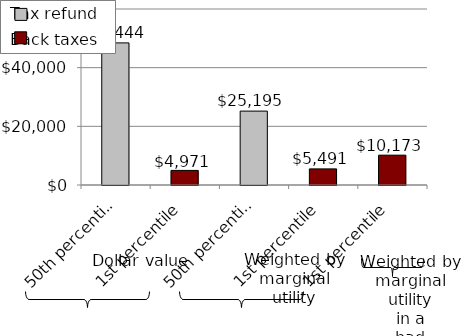
| Category | Series 0 |
|---|---|
| 50th percentile | 48444.12 |
| 1st percentile | 4970.809 |
| 50th percentile | 25195.289 |
| 1st percentile | 5490.678 |
| 1st percentile | 10172.508 |